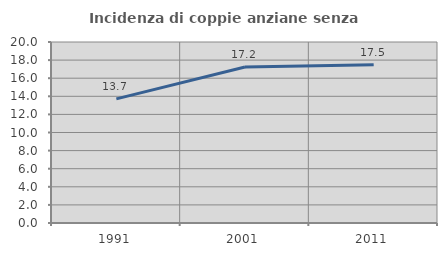
| Category | Incidenza di coppie anziane senza figli  |
|---|---|
| 1991.0 | 13.713 |
| 2001.0 | 17.233 |
| 2011.0 | 17.49 |